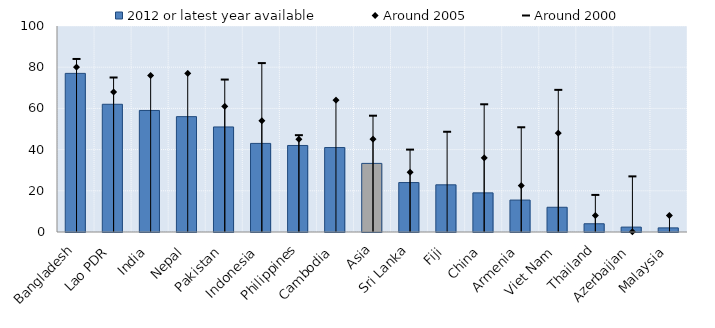
| Category | 2012 or latest year available |
|---|---|
| Bangladesh | 77 |
| Lao PDR | 62 |
| India | 59 |
| Nepal | 56 |
| Pakistan | 51 |
| Indonesia | 43 |
| Philippines | 42 |
| Cambodia | 41 |
| Asia | 33.299 |
| Sri Lanka | 24 |
| Fiji | 22.9 |
| China | 19 |
| Armenia | 15.5 |
| Viet Nam | 12 |
| Thailand | 4 |
| Azerbaijan | 2.38 |
| Malaysia | 2 |